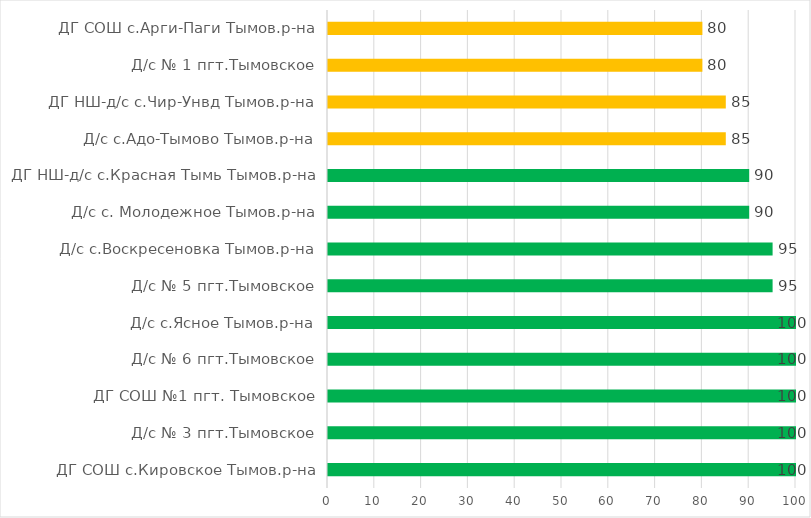
| Category | Series 0 |
|---|---|
| ДГ СОШ с.Кировское Тымов.р-на | 100 |
| Д/с № 3 пгт.Тымовское | 100 |
| ДГ СОШ №1 пгт. Тымовское | 100 |
| Д/с № 6 пгт.Тымовское | 100 |
| Д/с с.Ясное Тымов.р-на | 100 |
| Д/с № 5 пгт.Тымовское | 95 |
| Д/с с.Воскресеновка Тымов.р-на | 95 |
| Д/с с. Молодежное Тымов.р-на | 90 |
| ДГ НШ-д/с с.Красная Тымь Тымов.р-на | 90 |
| Д/с с.Адо-Тымово Тымов.р-на | 85 |
| ДГ НШ-д/с с.Чир-Унвд Тымов.р-на | 85 |
| Д/с № 1 пгт.Тымовское | 80 |
| ДГ СОШ с.Арги-Паги Тымов.р-на | 80 |